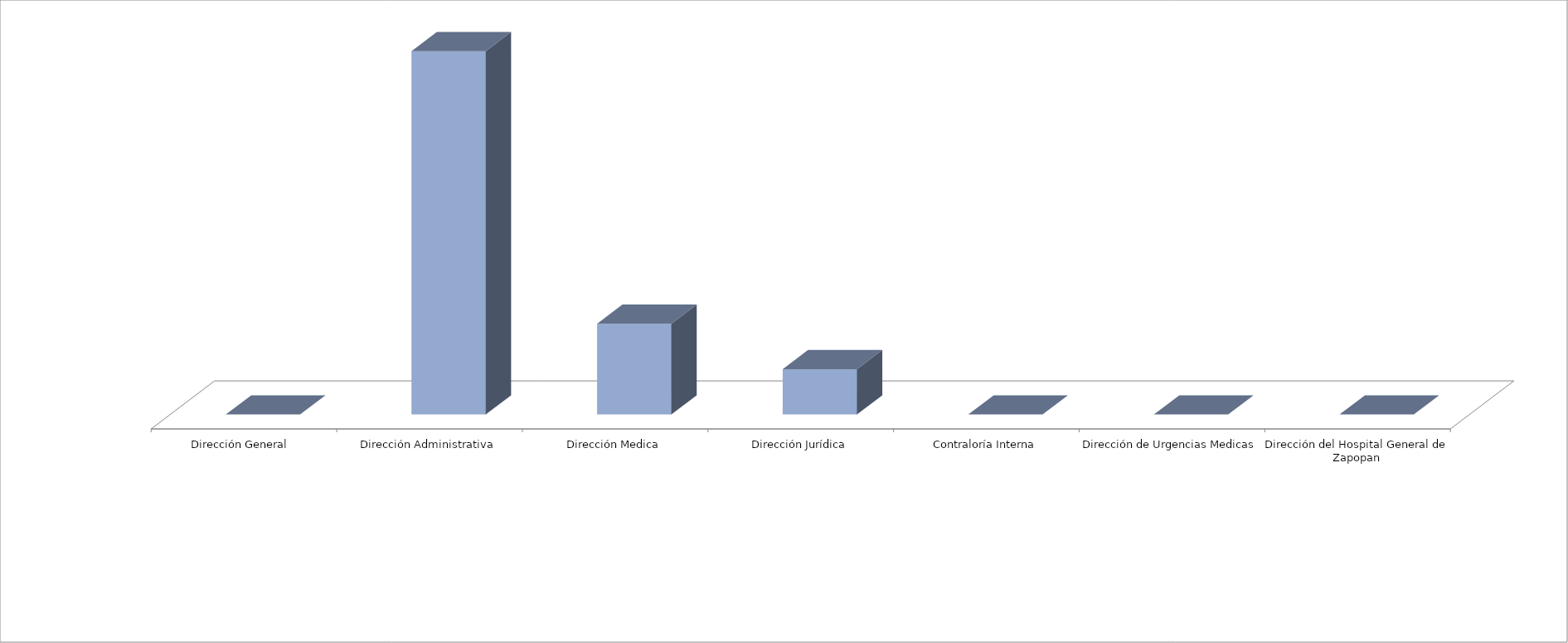
| Category | Series 0 | Series 1 |
|---|---|---|
| Dirección General  |  | 0 |
| Dirección Administrativa |  | 24 |
| Dirección Medica |  | 6 |
| Dirección Jurídica |  | 3 |
| Contraloría Interna |  | 0 |
| Dirección de Urgencias Medicas |  | 0 |
| Dirección del Hospital General de Zapopan |  | 0 |